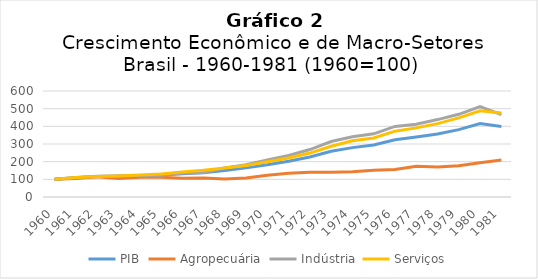
| Category | PIB | Agropecuária | Indústria | Serviços |
|---|---|---|---|---|
| 1960.0 | 100 | 100 | 100 | 100 |
| 1961.0 | 108.6 | 104.068 | 109.809 | 109.882 |
| 1962.0 | 115.768 | 113.971 | 117.267 | 116.321 |
| 1963.0 | 116.462 | 105.269 | 120.27 | 119.247 |
| 1964.0 | 120.422 | 111.312 | 122.349 | 124.044 |
| 1965.0 | 123.312 | 111.23 | 123.364 | 130.071 |
| 1966.0 | 131.574 | 106.619 | 135.803 | 141.816 |
| 1967.0 | 137.1 | 107.347 | 138.616 | 151.245 |
| 1968.0 | 150.536 | 101.402 | 164.954 | 163.756 |
| 1969.0 | 164.837 | 107.251 | 183.313 | 178.703 |
| 1970.0 | 181.98 | 122.542 | 210.325 | 198.957 |
| 1971.0 | 202.616 | 135.041 | 235.144 | 221.24 |
| 1972.0 | 226.809 | 140.443 | 268.534 | 248.674 |
| 1973.0 | 258.494 | 140.583 | 314.185 | 287.467 |
| 1974.0 | 279.561 | 142.411 | 340.89 | 317.939 |
| 1975.0 | 294.014 | 151.81 | 357.594 | 333.836 |
| 1976.0 | 324.18 | 155.453 | 399.432 | 372.561 |
| 1977.0 | 340.162 | 174.263 | 411.815 | 391.189 |
| 1978.0 | 357.068 | 169.558 | 438.171 | 415.443 |
| 1979.0 | 381.206 | 177.527 | 467.967 | 447.847 |
| 1980.0 | 416.392 | 194.428 | 511.254 | 488.243 |
| 1981.0 | 398.695 | 209.924 | 466.059 | 476.134 |